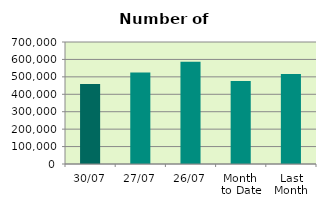
| Category | Series 0 |
|---|---|
| 30/07 | 459314 |
| 27/07 | 524570 |
| 26/07 | 586668 |
| Month 
to Date | 475718.857 |
| Last
Month | 516911.429 |